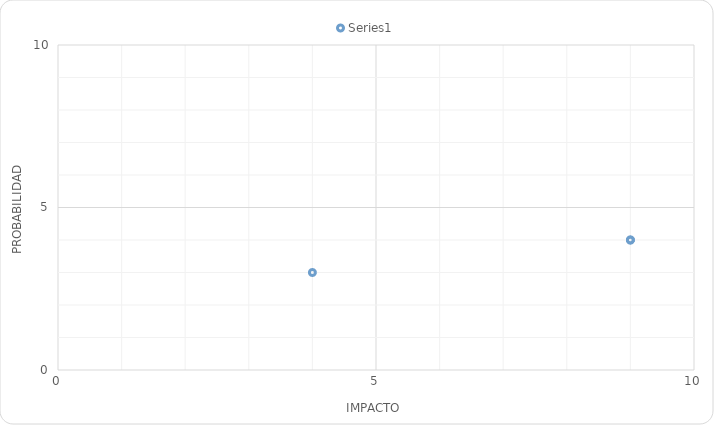
| Category | Series 0 |
|---|---|
| 9.0 | 4 |
| 9.0 | 4 |
| 4.0 | 3 |